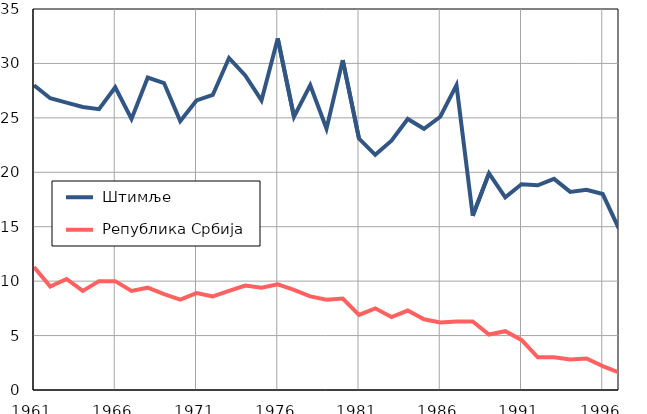
| Category |  Штимље |  Република Србија |
|---|---|---|
| 1961.0 | 28 | 11.3 |
| 1962.0 | 26.8 | 9.5 |
| 1963.0 | 26.4 | 10.2 |
| 1964.0 | 26 | 9.1 |
| 1965.0 | 25.8 | 10 |
| 1966.0 | 27.8 | 10 |
| 1967.0 | 24.9 | 9.1 |
| 1968.0 | 28.7 | 9.4 |
| 1969.0 | 28.2 | 8.8 |
| 1970.0 | 24.7 | 8.3 |
| 1971.0 | 26.6 | 8.9 |
| 1972.0 | 27.1 | 8.6 |
| 1973.0 | 30.5 | 9.1 |
| 1974.0 | 28.9 | 9.6 |
| 1975.0 | 26.6 | 9.4 |
| 1976.0 | 32.3 | 9.7 |
| 1977.0 | 25.1 | 9.2 |
| 1978.0 | 28 | 8.6 |
| 1979.0 | 24 | 8.3 |
| 1980.0 | 30.3 | 8.4 |
| 1981.0 | 23.1 | 6.9 |
| 1982.0 | 21.6 | 7.5 |
| 1983.0 | 22.9 | 6.7 |
| 1984.0 | 24.9 | 7.3 |
| 1985.0 | 24 | 6.5 |
| 1986.0 | 25.1 | 6.2 |
| 1987.0 | 28 | 6.3 |
| 1988.0 | 16 | 6.3 |
| 1989.0 | 19.9 | 5.1 |
| 1990.0 | 17.7 | 5.4 |
| 1991.0 | 18.9 | 4.6 |
| 1992.0 | 18.8 | 3 |
| 1993.0 | 19.4 | 3 |
| 1994.0 | 18.2 | 2.8 |
| 1995.0 | 18.4 | 2.9 |
| 1996.0 | 18 | 2.2 |
| 1997.0 | 14.8 | 1.6 |